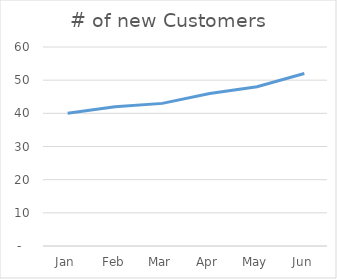
| Category | # of new Customers |
|---|---|
| Jan | 40 |
| Feb | 42 |
| Mar | 43 |
| Apr | 46 |
| May | 48 |
| Jun | 52 |